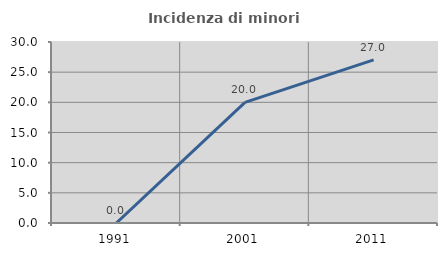
| Category | Incidenza di minori stranieri |
|---|---|
| 1991.0 | 0 |
| 2001.0 | 20 |
| 2011.0 | 27.027 |